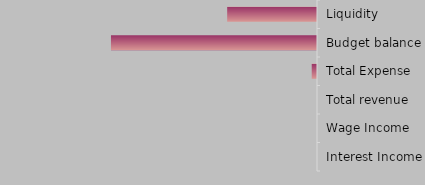
| Category | Series 0 |
|---|---|
| Interest Income | 0 |
| Wage Income | 0 |
| Total revenue | 0 |
| Total Expense | 50 |
| Budget balance | 1950 |
| Liquidity | 850 |